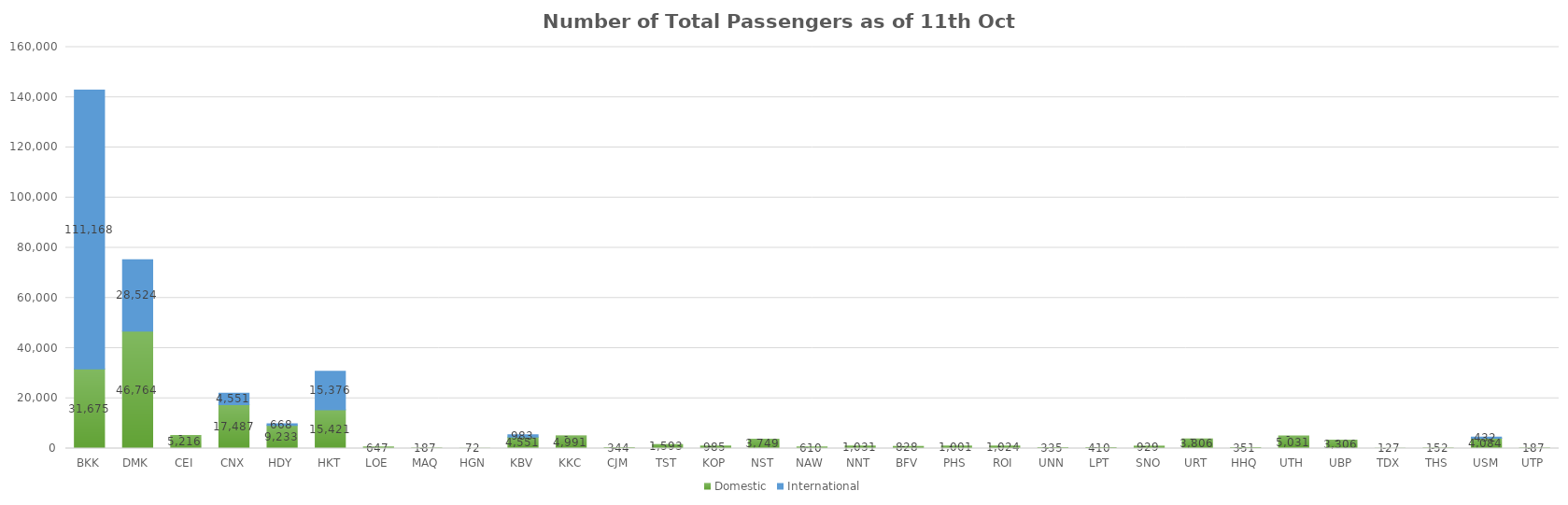
| Category | Domestic | International |
|---|---|---|
| BKK | 31675 | 111168 |
| DMK | 46764 | 28524 |
| CEI | 5216 | 0 |
| CNX | 17487 | 4551 |
| HDY | 9233 | 668 |
| HKT | 15421 | 15376 |
| LOE | 647 | 0 |
| MAQ | 187 | 0 |
| HGN | 72 | 0 |
| KBV | 4551 | 983 |
| KKC | 4991 | 0 |
| CJM | 344 | 0 |
| TST | 1593 | 0 |
| KOP | 985 | 0 |
| NST | 3749 | 0 |
| NAW | 610 | 0 |
| NNT | 1031 | 0 |
| BFV | 828 | 0 |
| PHS | 1001 | 0 |
| ROI | 1024 | 0 |
| UNN | 335 | 0 |
| LPT | 410 | 0 |
| SNO | 929 | 0 |
| URT | 3806 | 0 |
| HHQ | 351 | 0 |
| UTH | 5031 | 0 |
| UBP | 3306 | 0 |
| TDX | 127 | 0 |
| THS | 152 | 0 |
| USM | 4084 | 432 |
| UTP | 187 | 0 |